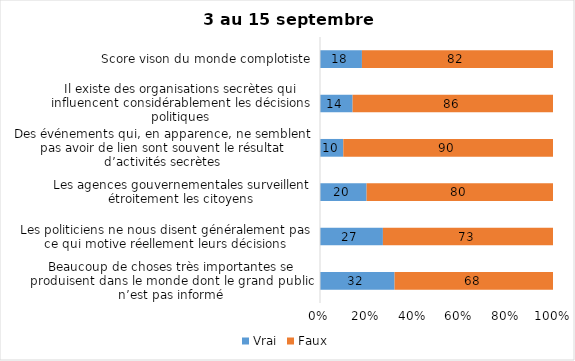
| Category | Vrai | Faux |
|---|---|---|
| Beaucoup de choses très importantes se produisent dans le monde dont le grand public n’est pas informé | 32 | 68 |
| Les politiciens ne nous disent généralement pas ce qui motive réellement leurs décisions | 27 | 73 |
| Les agences gouvernementales surveillent étroitement les citoyens | 20 | 80 |
| Des événements qui, en apparence, ne semblent pas avoir de lien sont souvent le résultat d’activités secrètes | 10 | 90 |
| Il existe des organisations secrètes qui influencent considérablement les décisions politiques | 14 | 86 |
| Score vison du monde complotiste | 18 | 82 |